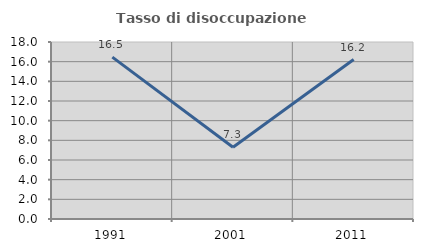
| Category | Tasso di disoccupazione giovanile  |
|---|---|
| 1991.0 | 16.463 |
| 2001.0 | 7.299 |
| 2011.0 | 16.216 |